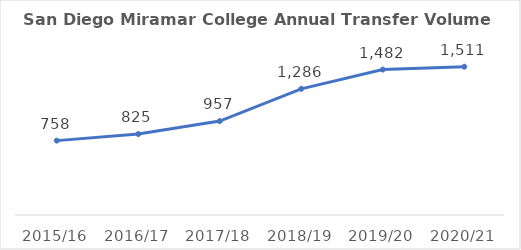
| Category | Series 0 |
|---|---|
| 2015/16 | 758 |
| 2016/17 | 825 |
| 2017/18 | 957 |
| 2018/19 | 1286 |
| 2019/20 | 1482 |
| 2020/21 | 1511 |